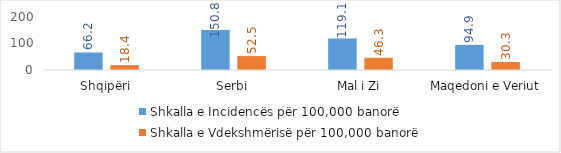
| Category |  Shkalla e Incidencës për 100,000 banorë  | Shkalla e Vdekshmërisë për 100,000 banorë |
|---|---|---|
| Shqipëri | 66.2 | 18.4 |
| Serbi | 150.8 | 52.5 |
| Mal i Zi | 119.1 | 46.3 |
| Maqedoni e Veriut | 94.9 | 30.3 |